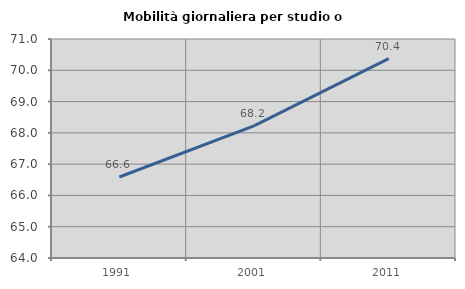
| Category | Mobilità giornaliera per studio o lavoro |
|---|---|
| 1991.0 | 66.59 |
| 2001.0 | 68.223 |
| 2011.0 | 70.374 |